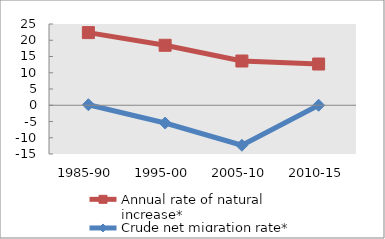
| Category | Annual rate of natural increase* | Crude net migration rate* |
|---|---|---|
| 1985-90 | 22.355 | 0.16 |
| 1995-00 | 18.454 | -5.472 |
| 2005-10 | 13.611 | -12.303 |
| 2010-15 | 12.686 | 0 |